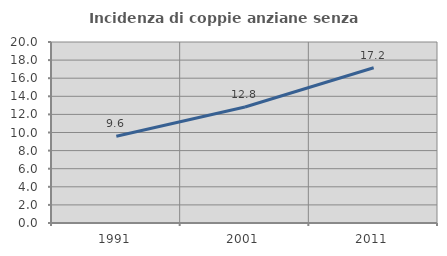
| Category | Incidenza di coppie anziane senza figli  |
|---|---|
| 1991.0 | 9.578 |
| 2001.0 | 12.823 |
| 2011.0 | 17.154 |